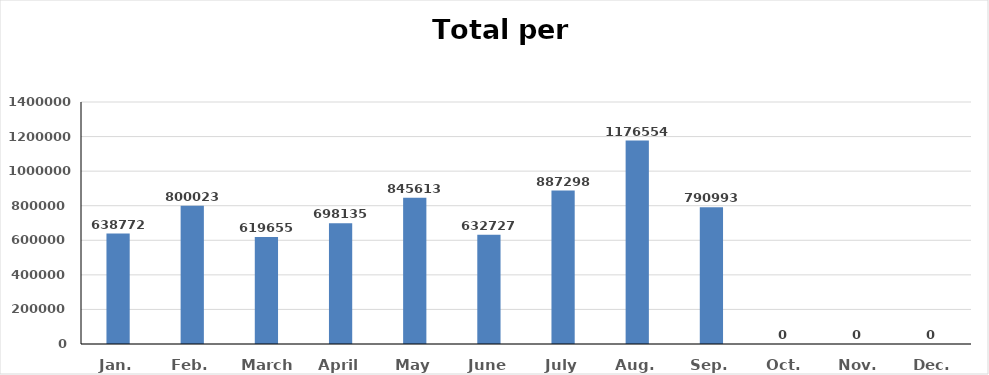
| Category | Series 0 |
|---|---|
| Jan. | 638772 |
| Feb. | 800023 |
| March | 619655 |
| April | 698135 |
| May | 845613 |
| June | 632727 |
| July | 887298 |
| Aug. | 1176554 |
| Sep. | 790993 |
| Oct. | 0 |
| Nov. | 0 |
| Dec. | 0 |